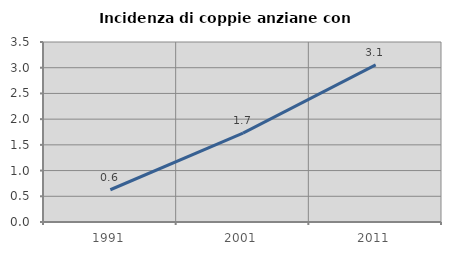
| Category | Incidenza di coppie anziane con figli |
|---|---|
| 1991.0 | 0.627 |
| 2001.0 | 1.729 |
| 2011.0 | 3.055 |